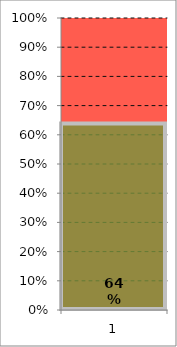
| Category | Series 0 |
|---|---|
| 0 | 0.639 |